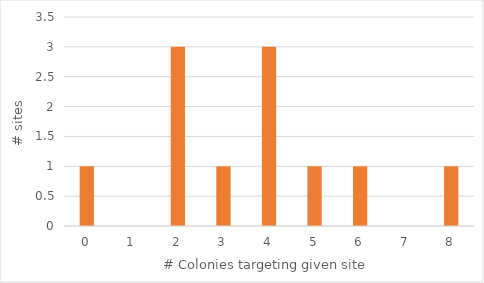
| Category | Series 1 |
|---|---|
| 0.0 | 1 |
| 1.0 | 0 |
| 2.0 | 3 |
| 3.0 | 1 |
| 4.0 | 3 |
| 5.0 | 1 |
| 6.0 | 1 |
| 7.0 | 0 |
| 8.0 | 1 |